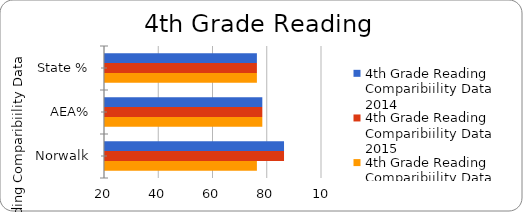
| Category | 4th Grade Reading Comparibiility Data 2014 | 4th Grade Reading Comparibiility Data 2015 | 4th Grade Reading Comparibiility Data 2016 |
|---|---|---|---|
| State % | 76 | 76 | 76 |
| AEA% | 78 | 78 | 78 |
| Norwalk | 86 | 86 | 76 |